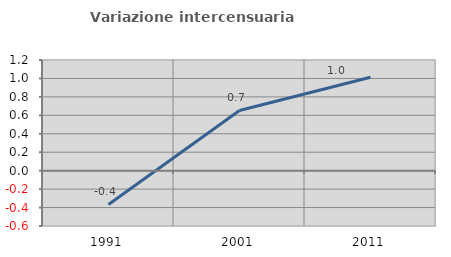
| Category | Variazione intercensuaria annua |
|---|---|
| 1991.0 | -0.366 |
| 2001.0 | 0.653 |
| 2011.0 | 1.013 |